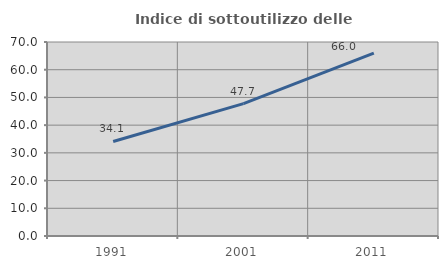
| Category | Indice di sottoutilizzo delle abitazioni  |
|---|---|
| 1991.0 | 34.112 |
| 2001.0 | 47.748 |
| 2011.0 | 65.979 |